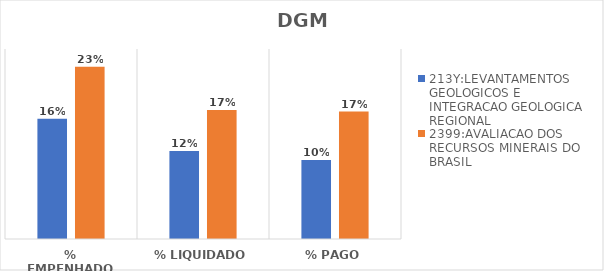
| Category | 213Y:LEVANTAMENTOS GEOLOGICOS E INTEGRACAO GEOLOGICA REGIONAL | 2399:AVALIACAO DOS RECURSOS MINERAIS DO BRASIL |
|---|---|---|
| % EMPENHADO | 0.158 | 0.227 |
| % LIQUIDADO | 0.116 | 0.17 |
| % PAGO | 0.104 | 0.168 |